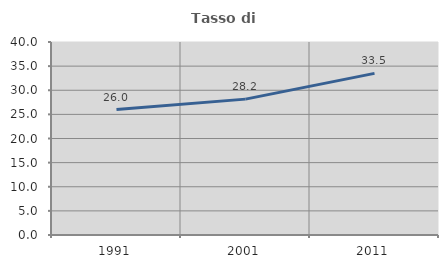
| Category | Tasso di occupazione   |
|---|---|
| 1991.0 | 25.993 |
| 2001.0 | 28.161 |
| 2011.0 | 33.502 |